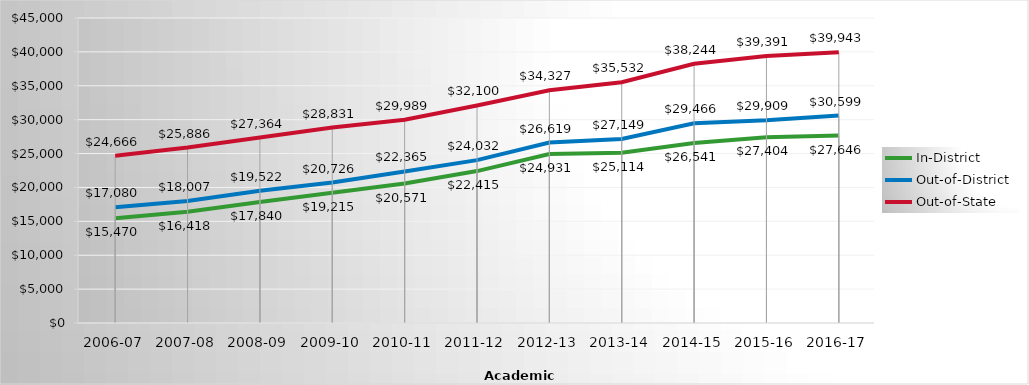
| Category | In-District | Out-of-District | Out-of-State |
|---|---|---|---|
| 2006-07 | 15470 | 17080 | 24666 |
| 2007-08 | 16418 | 18007 | 25886 |
| 2008-09 | 17839.697 | 19521.65 | 27363.58 |
| 2009-10 | 19215 | 20726 | 28831 |
| 2010-11 | 20571 | 22365 | 29989 |
| 2011-12 | 22415 | 24032 | 32100 |
| 2012-13 | 24931 | 26619 | 34327 |
| 2013-14 | 25114.27 | 27148.6 | 35532.25 |
| 2014-15 | 26541.34 | 29465.87 | 38243.8 |
| 2015-16 | 27404 | 29909 | 39391 |
| 2016-17 | 27646 | 30599 | 39943 |